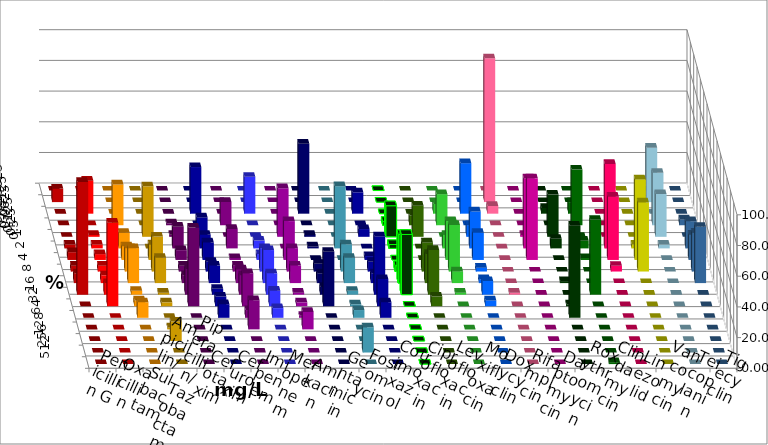
| Category | Penicillin G | Oxacillin | Ampicillin/ Sulbactam | Piperacillin/ Tazobactam | Cefotaxim | Cefuroxim | Imipenem | Meropenem | Amikacin | Gentamicin | Fosfomycin | Cotrimoxazol | Ciprofloxacin | Levofloxacin | Moxifloxacin | Doxycyclin | Rifampicin | Daptomycin | Roxythromycin | Clindamycin | Linezolid | Vancomycin | Teicoplanin | Tigecyclin |
|---|---|---|---|---|---|---|---|---|---|---|---|---|---|---|---|---|---|---|---|---|---|---|---|---|
| 0.015625 | 0 | 0 | 0 | 0 | 0 | 0 | 0 | 0 | 0 | 0 | 0 | 0 | 0 | 0 | 0 | 0 | 0 | 0 | 0 | 0 | 0 | 0 | 0 | 0 |
| 0.03125 | 8.861 | 0 | 0 | 0 | 0 | 0 | 0 | 0 | 0 | 0 | 0 | 0 | 0 | 0 | 0 | 0 | 93.671 | 0 | 0 | 0 | 0 | 0 | 0 | 35.443 |
| 0.0625 | 0 | 21.519 | 0 | 0 | 0 | 0 | 30.38 | 24.051 | 0 | 45.57 | 0 | 13.924 | 0 | 0 | 6.329 | 32.911 | 5.063 | 0 | 3.75 | 7.5 | 0 | 0 | 0 | 0 |
| 0.125 | 0 | 0 | 26.582 | 0 | 1.282 | 15.19 | 0 | 0 | 0 | 0 | 0 | 0 | 2.532 | 6.329 | 20.253 | 0 | 0 | 0 | 0 | 36.25 | 0 | 0 | 3.797 | 34.177 |
| 0.25 | 0 | 1.266 | 0 | 32.911 | 1.282 | 0 | 12.658 | 0 | 31.646 | 1.266 | 0 | 5.063 | 20.253 | 20.253 | 0 | 7.595 | 0 | 1.266 | 27.5 | 0 | 0 | 0 | 0 | 27.848 |
| 0.5 | 2.532 | 2.532 | 10.127 | 0 | 14.103 | 12.658 | 8.861 | 5.063 | 0 | 1.266 | 40.506 | 0 | 2.532 | 0 | 8.861 | 24.051 | 0 | 45.57 | 6.25 | 5 | 55 | 2.5 | 17.722 | 2.532 |
| 1.0 | 5.063 | 3.797 | 8.861 | 10.127 | 6.41 | 1.266 | 11.392 | 3.797 | 25.316 | 0 | 0 | 2.532 | 0 | 0 | 25.316 | 17.722 | 0 | 53.165 | 0 | 1.25 | 41.25 | 52.5 | 16.456 | 0 |
| 2.0 | 3.797 | 3.797 | 15.19 | 22.785 | 3.846 | 3.797 | 6.329 | 15.19 | 15.19 | 5.063 | 17.722 | 6.329 | 3.797 | 18.987 | 30.38 | 2.532 | 0 | 0 | 0 | 0 | 3.75 | 45 | 25.316 | 0 |
| 4.0 | 6.329 | 5.063 | 22.785 | 16.456 | 5.128 | 8.861 | 11.392 | 21.519 | 11.392 | 6.329 | 16.456 | 6.329 | 31.646 | 18.987 | 7.595 | 2.532 | 0 | 0 | 1.25 | 0 | 0 | 0 | 36.709 | 0 |
| 8.0 | 73.418 | 7.595 | 2.532 | 1.266 | 16.667 | 12.658 | 3.797 | 13.924 | 1.266 | 5.063 | 2.532 | 37.975 | 39.241 | 29.114 | 1.266 | 8.861 | 1.266 | 0 | 0 | 48.75 | 0 | 0 | 0 | 0 |
| 16.0 | 0 | 54.43 | 3.797 | 2.532 | 51.282 | 21.519 | 6.329 | 10.127 | 2.532 | 35.443 | 1.266 | 17.722 | 0 | 6.329 | 0 | 3.797 | 0 | 0 | 1.25 | 0 | 0 | 0 | 0 | 0 |
| 32.0 | 0 | 0 | 10.127 | 0 | 0 | 5.063 | 8.861 | 6.329 | 1.266 | 0 | 5.063 | 10.127 | 0 | 0 | 0 | 0 | 0 | 0 | 60 | 0 | 0 | 0 | 0 | 0 |
| 64.0 | 0 | 0 | 0 | 1.266 | 0 | 18.987 | 0 | 0 | 11.392 | 0 | 0 | 0 | 0 | 0 | 0 | 0 | 0 | 0 | 0 | 0 | 0 | 0 | 0 | 0 |
| 128.0 | 0 | 0 | 0 | 12.658 | 0 | 0 | 0 | 0 | 0 | 0 | 0 | 0 | 0 | 0 | 0 | 0 | 0 | 0 | 0 | 0 | 0 | 0 | 0 | 0 |
| 256.0 | 0 | 0 | 0 | 0 | 0 | 0 | 0 | 0 | 0 | 0 | 16.456 | 0 | 0 | 0 | 0 | 0 | 0 | 0 | 0 | 0 | 0 | 0 | 0 | 0 |
| 512.0 | 0 | 0 | 0 | 0 | 0 | 0 | 0 | 0 | 0 | 0 | 0 | 0 | 0 | 0 | 0 | 0 | 0 | 0 | 0 | 1.25 | 0 | 0 | 0 | 0 |